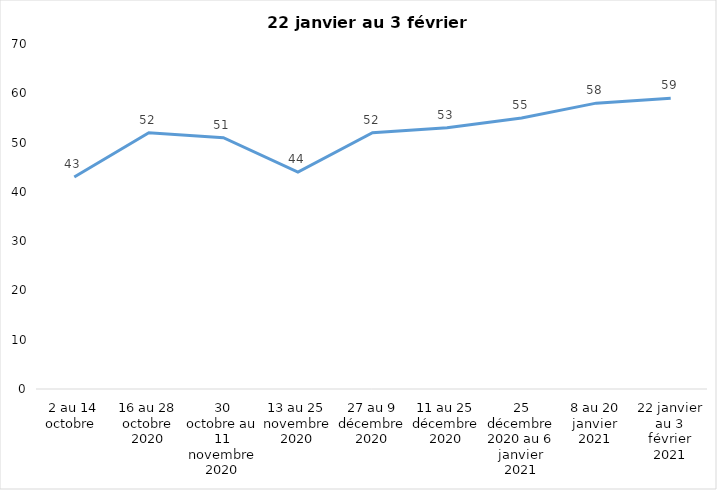
| Category | Toujours aux trois mesures |
|---|---|
| 2 au 14 octobre  | 43 |
| 16 au 28 octobre 2020 | 52 |
| 30 octobre au 11 novembre 2020 | 51 |
| 13 au 25 novembre 2020 | 44 |
| 27 au 9 décembre 2020 | 52 |
| 11 au 25 décembre 2020 | 53 |
| 25 décembre 2020 au 6 janvier 2021 | 55 |
| 8 au 20 janvier 2021 | 58 |
| 22 janvier au 3 février 2021 | 59 |